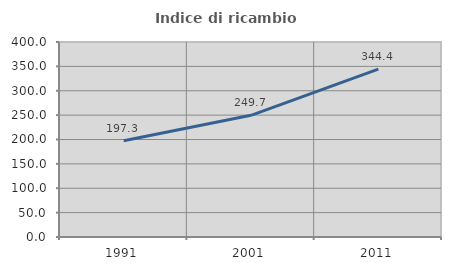
| Category | Indice di ricambio occupazionale  |
|---|---|
| 1991.0 | 197.347 |
| 2001.0 | 249.658 |
| 2011.0 | 344.361 |